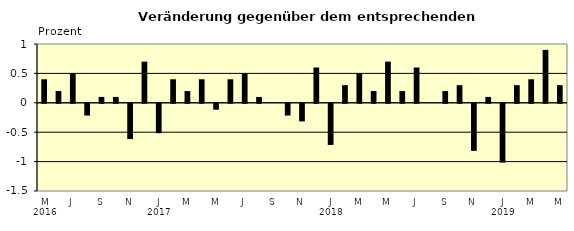
| Category | Series 0 |
|---|---|
| 0 | 0.4 |
| 1 | 0.2 |
| 2 | 0.5 |
| 3 | -0.2 |
| 4 | 0.1 |
| 5 | 0.1 |
| 6 | -0.6 |
| 7 | 0.7 |
| 8 | -0.5 |
| 9 | 0.4 |
| 10 | 0.2 |
| 11 | 0.4 |
| 12 | -0.1 |
| 13 | 0.4 |
| 14 | 0.5 |
| 15 | 0.1 |
| 16 | 0 |
| 17 | -0.2 |
| 18 | -0.3 |
| 19 | 0.6 |
| 20 | -0.7 |
| 21 | 0.3 |
| 22 | 0.5 |
| 23 | 0.2 |
| 24 | 0.7 |
| 25 | 0.2 |
| 26 | 0.6 |
| 27 | 0 |
| 28 | 0.2 |
| 29 | 0.3 |
| 30 | -0.8 |
| 31 | 0.1 |
| 32 | -1 |
| 33 | 0.3 |
| 34 | 0.4 |
| 35 | 0.9 |
| 36 | 0.3 |